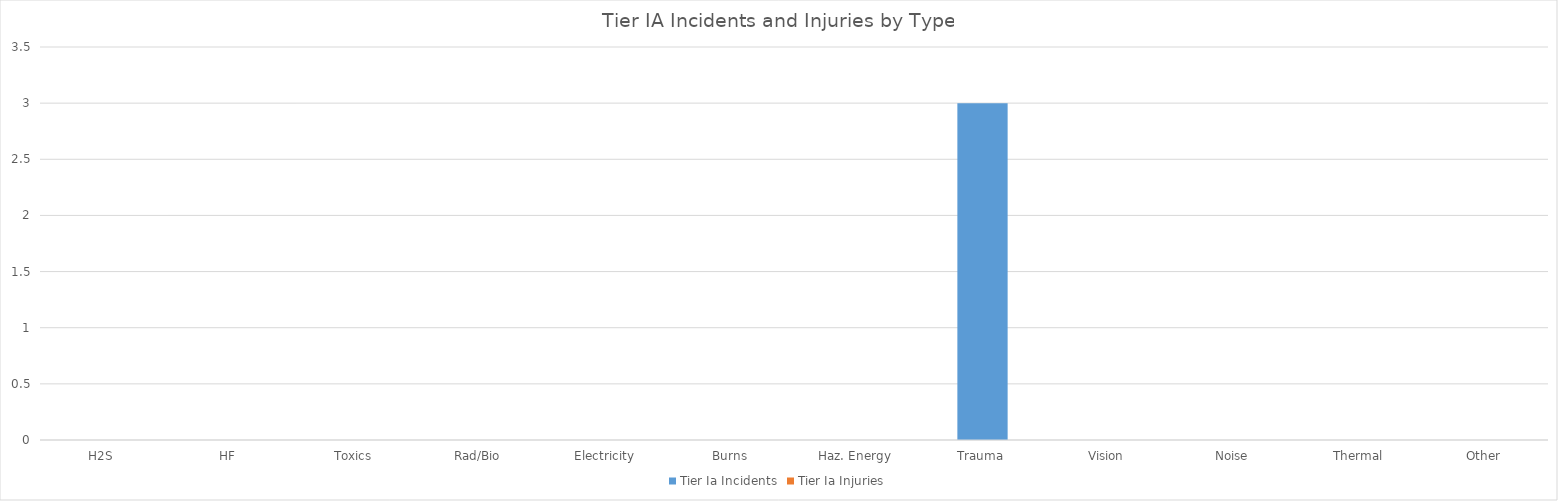
| Category | Tier Ia |
|---|---|
| H2S | 0 |
| HF | 0 |
| Toxics | 0 |
| Rad/Bio | 0 |
| Electricity | 0 |
| Burns | 0 |
| Haz. Energy | 0 |
| Trauma | 0 |
| Vision | 0 |
| Noise | 0 |
| Thermal | 0 |
| Other | 0 |